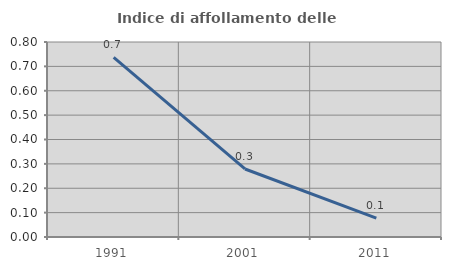
| Category | Indice di affollamento delle abitazioni  |
|---|---|
| 1991.0 | 0.737 |
| 2001.0 | 0.279 |
| 2011.0 | 0.077 |